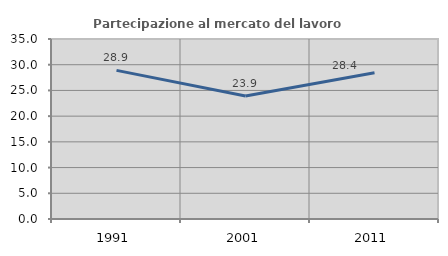
| Category | Partecipazione al mercato del lavoro  femminile |
|---|---|
| 1991.0 | 28.894 |
| 2001.0 | 23.906 |
| 2011.0 | 28.42 |